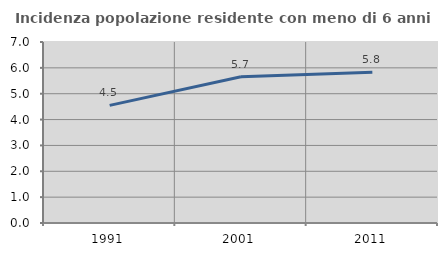
| Category | Incidenza popolazione residente con meno di 6 anni |
|---|---|
| 1991.0 | 4.55 |
| 2001.0 | 5.653 |
| 2011.0 | 5.835 |